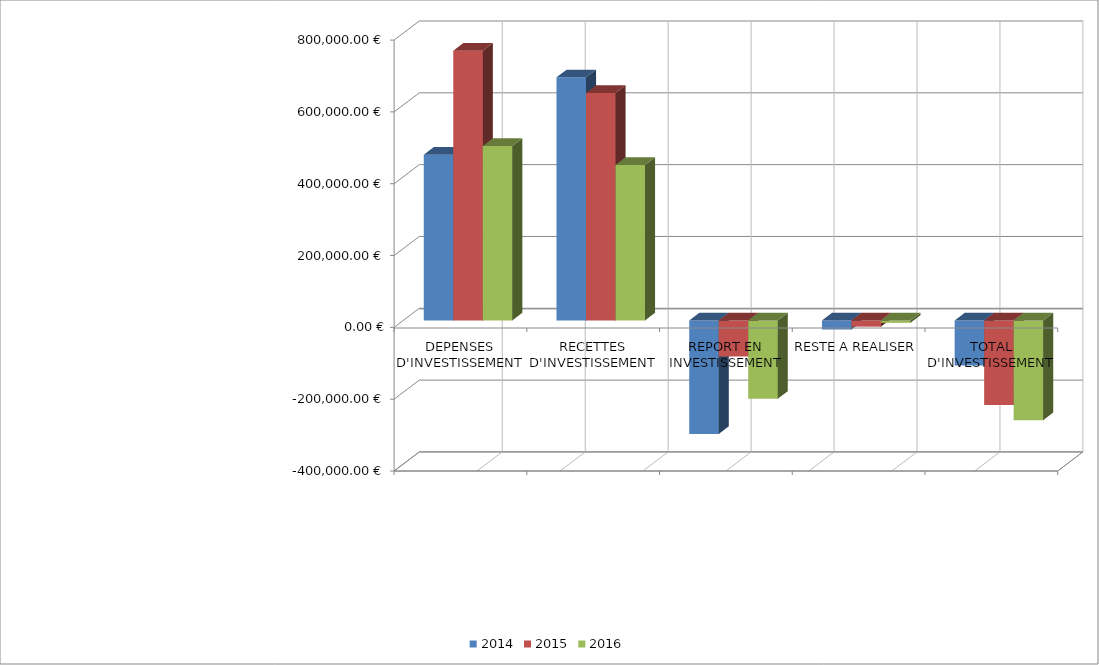
| Category | 2014 | 2015 | 2016 |
|---|---|---|---|
| DEPENSES D'INVESTISSEMENT | 461552 | 751478 | 485925 |
| RECETTES D'INVESTISSEMENT | 677088 | 633570 | 433139 |
| REPORT EN INVESTISSEMENT | -315832 | -100297 | -218205 |
| RESTE A REALISER | -25136 | -17185 | -6536 |
| TOTAL D'INVESTISSEMENT | -125432 | -235390 | -277527 |